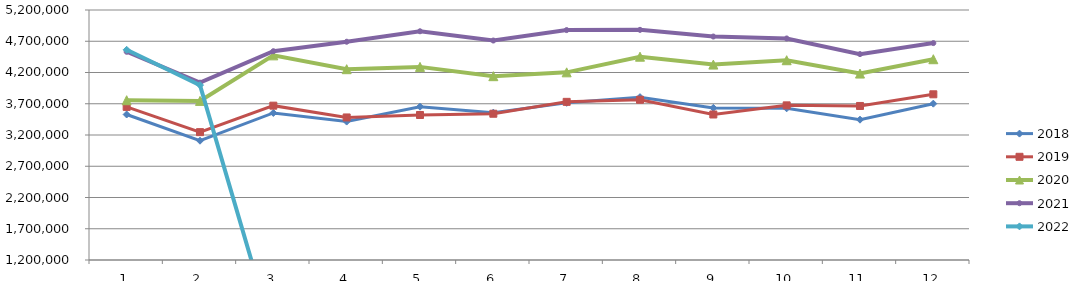
| Category | 2018 | 2019 | 2020 | 2021 | 2022 |
|---|---|---|---|---|---|
| 0 | 3528241.229 | 3649683.28 | 3756283.089 | 4531541.153 | 4563200.653 |
| 1 | 3108555.552 | 3245578.859 | 3745626.569 | 4037286.037 | 3998277.306 |
| 2 | 3553184.371 | 3669368.201 | 4474226.706 | 4540804.564 | 0 |
| 3 | 3414889.226 | 3480737.518 | 4252877.011 | 4692178.419 | 0 |
| 4 | 3653293.789 | 3520173.393 | 4289935.067 | 4859630.691 | 0 |
| 5 | 3557351.211 | 3540194.304 | 4141054.684 | 4711532.98 | 0 |
| 6 | 3714873.235 | 3730287.221 | 4202654.044 | 4878717.093 | 0 |
| 7 | 3805404.89 | 3764065.715 | 4452839.823 | 4882258.316 | 0 |
| 8 | 3633589.924 | 3528193.213 | 4326562.065 | 4775380.064 | 0 |
| 9 | 3626810.501 | 3674095.651 | 4396335.731 | 4744279.495 | 0 |
| 10 | 3445044.438 | 3664597.161 | 4182792.836 | 4494280.792 | 0 |
| 11 | 3701418.855 | 3851208.606 | 4412374.456 | 4670500.878 | 0 |